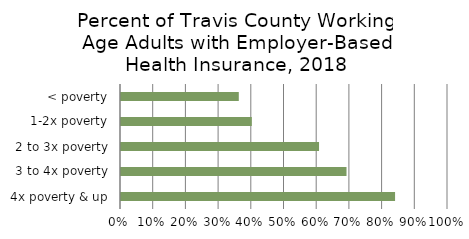
| Category | Series 0 |
|---|---|
| 4x poverty & up | 0.838 |
| 3 to 4x poverty | 0.69 |
| 2 to 3x poverty | 0.606 |
| 1-2x poverty | 0.4 |
| < poverty | 0.36 |